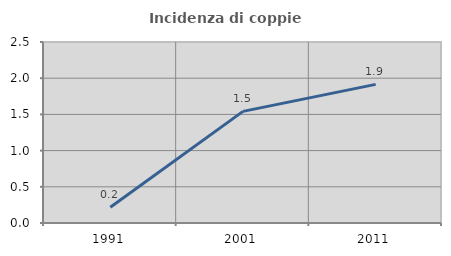
| Category | Incidenza di coppie miste |
|---|---|
| 1991.0 | 0.217 |
| 2001.0 | 1.542 |
| 2011.0 | 1.914 |